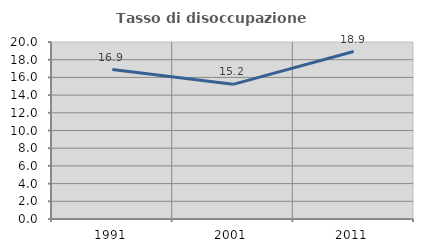
| Category | Tasso di disoccupazione giovanile  |
|---|---|
| 1991.0 | 16.883 |
| 2001.0 | 15.217 |
| 2011.0 | 18.919 |